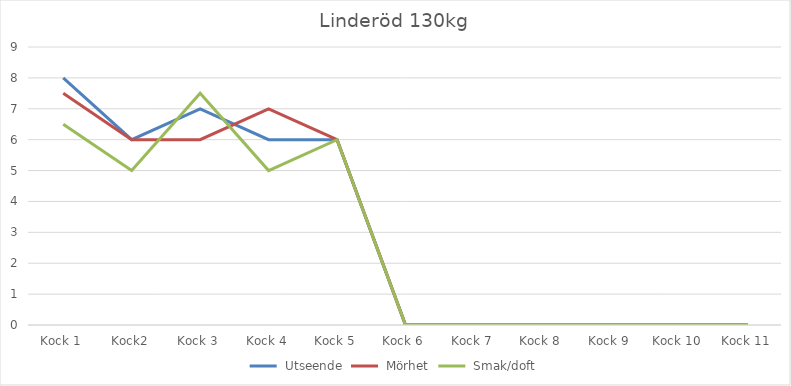
| Category | Utseende | Mörhet | Smak/doft |
|---|---|---|---|
| Kock 1 | 8 | 7.5 | 6.5 |
| Kock2 | 6 | 6 | 5 |
| Kock 3 | 7 | 6 | 7.5 |
| Kock 4 | 6 | 7 | 5 |
| Kock 5 | 6 | 6 | 6 |
| Kock 6 | 0 | 0 | 0 |
| Kock 7 | 0 | 0 | 0 |
| Kock 8 | 0 | 0 | 0 |
| Kock 9 | 0 | 0 | 0 |
| Kock 10 | 0 | 0 | 0 |
| Kock 11 | 0 | 0 | 0 |